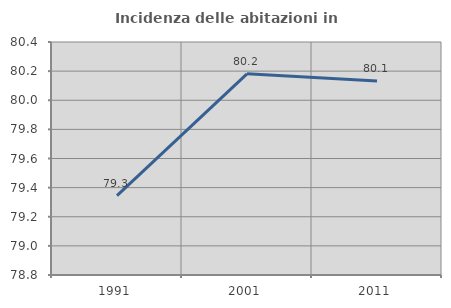
| Category | Incidenza delle abitazioni in proprietà  |
|---|---|
| 1991.0 | 79.345 |
| 2001.0 | 80.181 |
| 2011.0 | 80.133 |